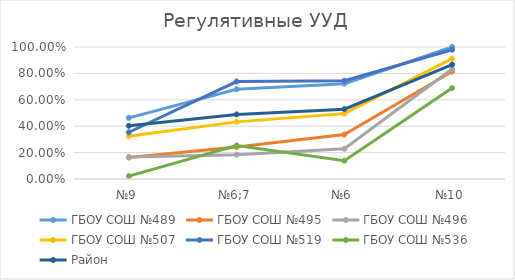
| Category | ГБОУ СОШ №489 | ГБОУ СОШ №495 | ГБОУ СОШ №496 | ГБОУ СОШ №507 | ГБОУ СОШ №519 | ГБОУ СОШ №536 | Район |
|---|---|---|---|---|---|---|---|
| №9 | 0.463 | 0.163 | 0.167 | 0.324 | 0.354 | 0.022 | 0.403 |
| №6;7 | 0.68 | 0.242 | 0.184 | 0.433 | 0.738 | 0.254 | 0.489 |
| №6 | 0.722 | 0.337 | 0.229 | 0.495 | 0.745 | 0.139 | 0.529 |
| №10 | 1 | 0.814 | 0.833 | 0.912 | 0.979 | 0.689 | 0.866 |